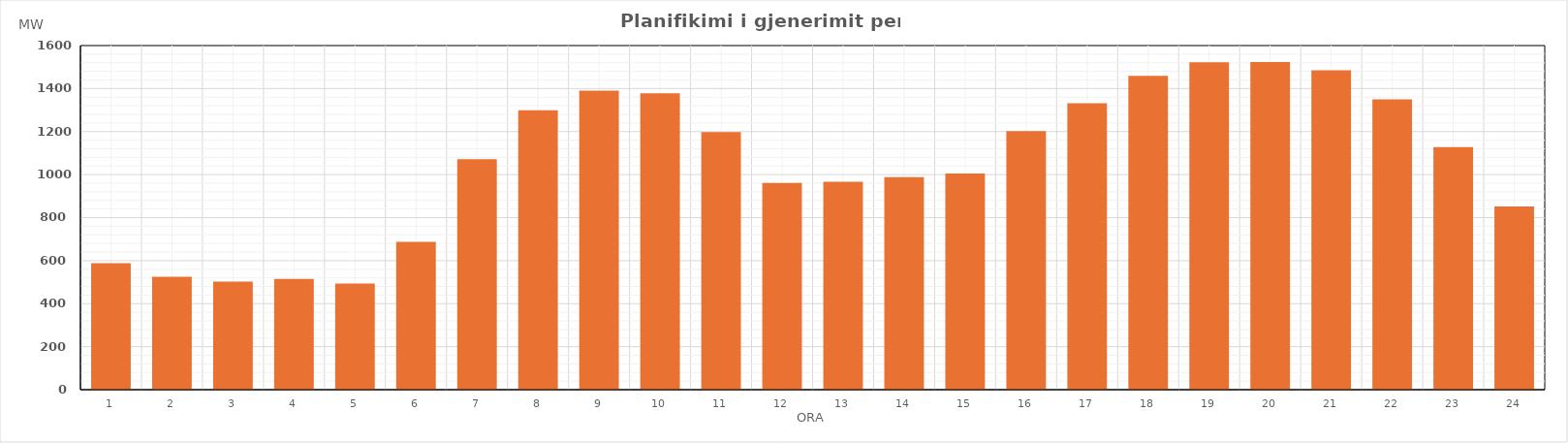
| Category | Max (MW) |
|---|---|
| 0 | 588.16 |
| 1 | 524.66 |
| 2 | 502.96 |
| 3 | 515.27 |
| 4 | 493.25 |
| 5 | 687.34 |
| 6 | 1071.02 |
| 7 | 1298.71 |
| 8 | 1390.93 |
| 9 | 1377.99 |
| 10 | 1197.89 |
| 11 | 960.58 |
| 12 | 966.27 |
| 13 | 988.09 |
| 14 | 1005.18 |
| 15 | 1202.4 |
| 16 | 1331.39 |
| 17 | 1459.07 |
| 18 | 1521.93 |
| 19 | 1523.13 |
| 20 | 1485.57 |
| 21 | 1349.56 |
| 22 | 1128.13 |
| 23 | 851.54 |